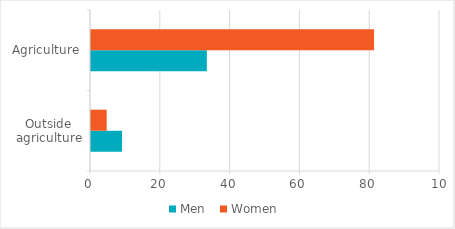
| Category | Men | Women |
|---|---|---|
| Outside agriculture | 8.9 | 4.5 |
| Agriculture | 33.2 | 81.1 |